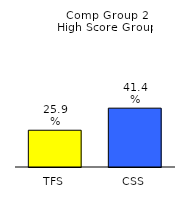
| Category | Series 0 |
|---|---|
| TFS | 0.259 |
| CSS | 0.414 |